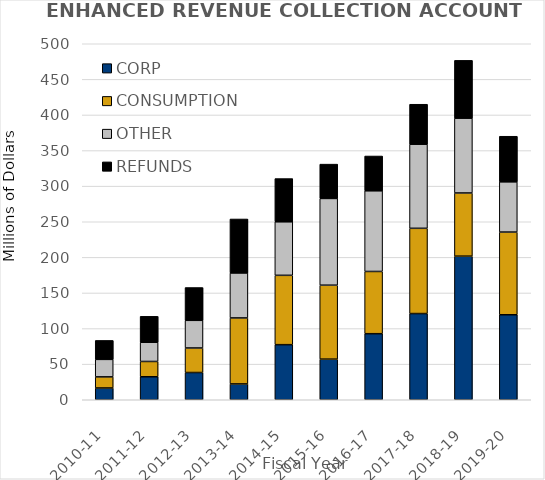
| Category | CORP | CONSUMPTION | OTHER | REFUNDS |
|---|---|---|---|---|
| 2010-11 | 16.544 | 15.6 | 24.584 | 26.616 |
| 2011-12 | 32.296 | 21.489 | 26.966 | 36.442 |
| 2012-13 | 38.267 | 34.443 | 38.85 | 46.078 |
| 2013-14 | 22.244 | 92.679 | 63.166 | 75.808 |
| 2014-15 | 77.364 | 97.403 | 75.186 | 60.722 |
| 2015-16 | 57.05 | 103.87 | 121.836 | 48.19 |
| 2016-17 | 92.764 | 87.418 | 113.313 | 48.854 |
| 2017-18 | 121.052 | 119.746 | 118.106 | 56.164 |
| 2018-19 | 201.686 | 88.72 | 105.119 | 81.127 |
| 2019-20 | 119.368 | 116.14 | 70.541 | 64.066 |